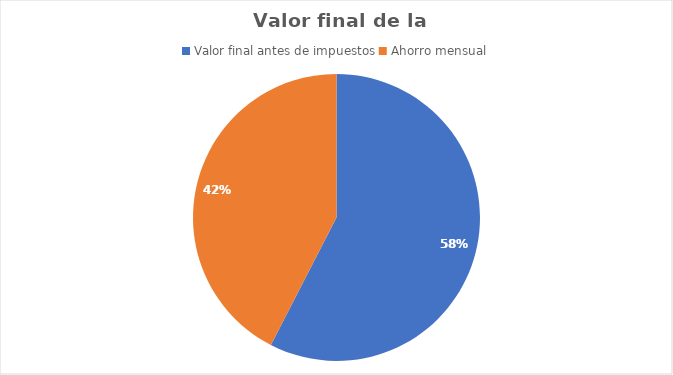
| Category | Series 0 |
|---|---|
| Valor final antes de impuestos | 12968.712 |
| Ahorro mensual | 9562.455 |